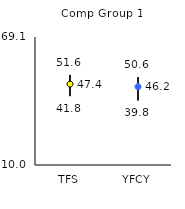
| Category | 25th | 75th | Mean |
|---|---|---|---|
| TFS | 41.8 | 51.6 | 47.35 |
| YFCY | 39.8 | 50.6 | 46.15 |